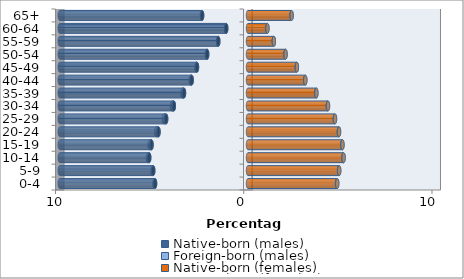
| Category | Native-born (males) | Foreign-born (males) | Native-born (females) | Foreign-born (females) |
|---|---|---|---|---|
| 0-4 | -4.937 | -0.031 | 4.729 | 0.013 |
| 5-9 | -5.034 | -0.039 | 4.836 | 0.012 |
| 10-14 | -5.248 | -0.068 | 5.068 | 0.014 |
| 15-19 | -5.124 | -0.096 | 5.007 | 0.015 |
| 20-24 | -4.755 | -0.116 | 4.825 | 0.014 |
| 25-29 | -4.349 | -0.115 | 4.614 | 0.012 |
| 30-34 | -3.939 | -0.099 | 4.242 | 0.01 |
| 35-39 | -3.4 | -0.076 | 3.625 | 0.008 |
| 40-44 | -2.992 | -0.052 | 3.038 | 0.007 |
| 45-49 | -2.711 | -0.034 | 2.592 | 0.005 |
| 50-54 | -2.168 | -0.02 | 1.991 | 0.003 |
| 55-59 | -1.579 | -0.012 | 1.37 | 0.002 |
| 60-64 | -1.157 | -0.006 | 1.028 | 0.001 |
| 65+ | -2.437 | -0.008 | 2.314 | 0.002 |